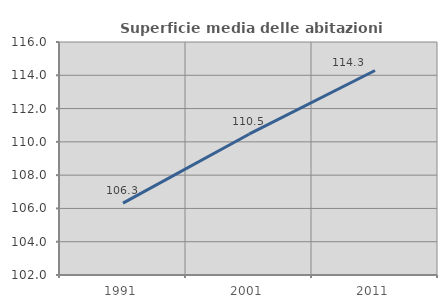
| Category | Superficie media delle abitazioni occupate |
|---|---|
| 1991.0 | 106.321 |
| 2001.0 | 110.461 |
| 2011.0 | 114.287 |